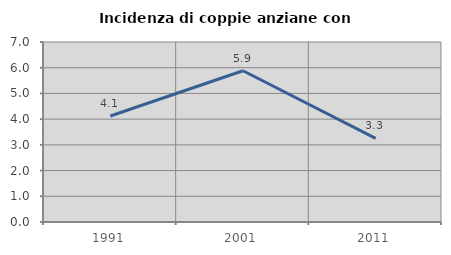
| Category | Incidenza di coppie anziane con figli |
|---|---|
| 1991.0 | 4.122 |
| 2001.0 | 5.882 |
| 2011.0 | 3.25 |